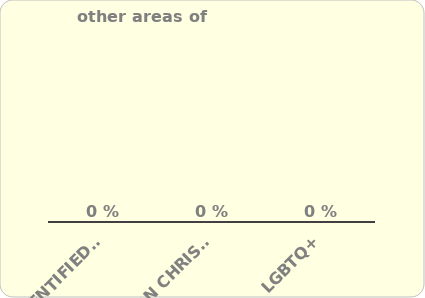
| Category | Series 0 |
|---|---|
| Identified as Disadvantaged | 0 |
| non Christian Religion | 0 |
| LGBTQ+ | 0 |